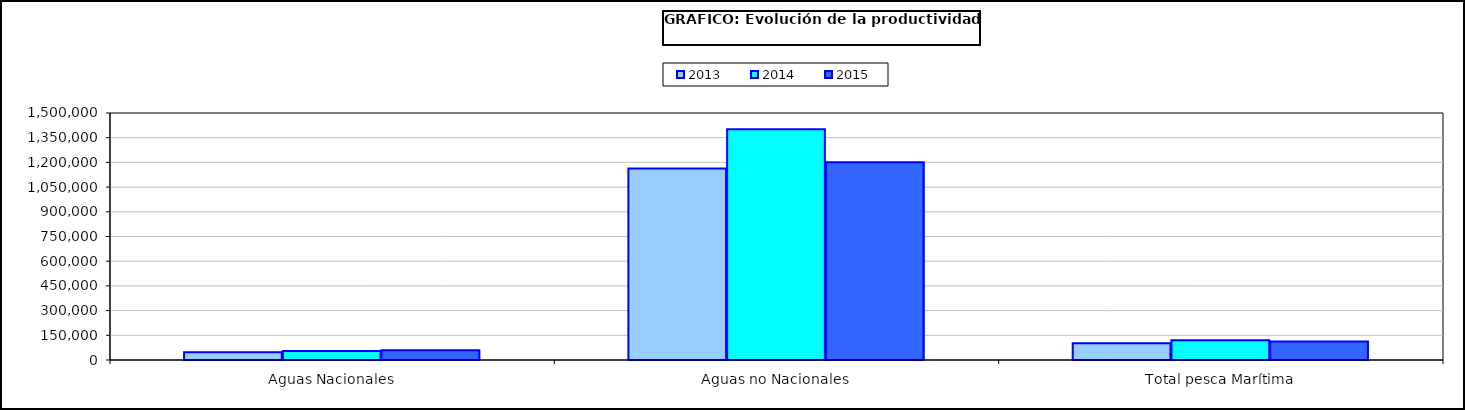
| Category | 2013 | 2014 | 2015 |
|---|---|---|---|
| 0 | 47026.449 | 54780.687 | 58558.794 |
| 1 | 1163471.318 | 1402056.645 | 1201114.948 |
| 2 | 101103.255 | 119254.033 | 112588.623 |